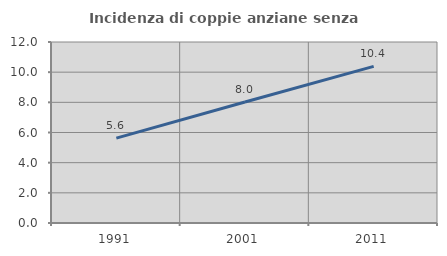
| Category | Incidenza di coppie anziane senza figli  |
|---|---|
| 1991.0 | 5.626 |
| 2001.0 | 8.024 |
| 2011.0 | 10.385 |